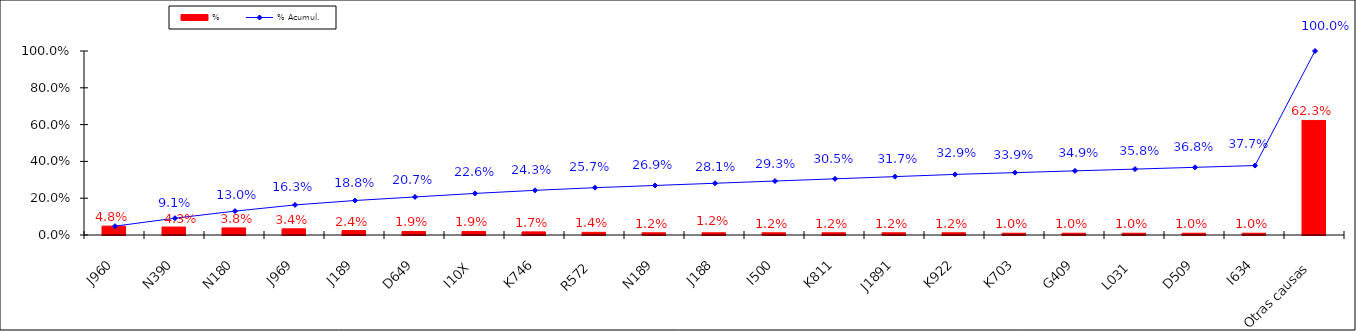
| Category | % |
|---|---|
| J960 | 0.048 |
| N390 | 0.043 |
| N180 | 0.038 |
| J969 | 0.034 |
| J189 | 0.024 |
| D649 | 0.019 |
| I10X | 0.019 |
| K746 | 0.017 |
| R572 | 0.014 |
| N189 | 0.012 |
| J188 | 0.012 |
| I500 | 0.012 |
| K811 | 0.012 |
| J1891 | 0.012 |
| K922 | 0.012 |
| K703 | 0.01 |
| G409 | 0.01 |
| L031 | 0.01 |
| D509 | 0.01 |
| I634 | 0.01 |
| Otras causas | 0.623 |